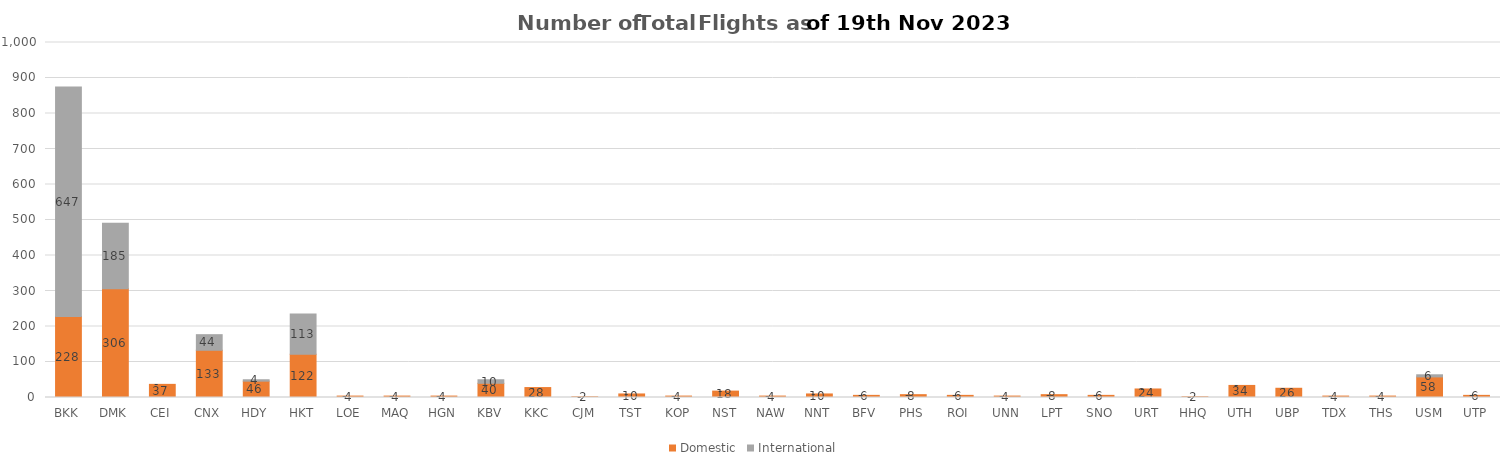
| Category | Domestic | International |
|---|---|---|
| BKK | 228 | 647 |
| DMK | 306 | 185 |
| CEI | 37 | 0 |
| CNX | 133 | 44 |
| HDY | 46 | 4 |
| HKT | 122 | 113 |
| LOE | 4 | 0 |
| MAQ | 4 | 0 |
| HGN | 4 | 0 |
| KBV | 40 | 10 |
| KKC | 28 | 0 |
| CJM | 2 | 0 |
| TST | 10 | 0 |
| KOP | 4 | 0 |
| NST | 18 | 0 |
| NAW | 4 | 0 |
| NNT | 10 | 0 |
| BFV | 6 | 0 |
| PHS | 8 | 0 |
| ROI | 6 | 0 |
| UNN | 4 | 0 |
| LPT | 8 | 0 |
| SNO | 6 | 0 |
| URT | 24 | 0 |
| HHQ | 2 | 0 |
| UTH | 34 | 0 |
| UBP | 26 | 0 |
| TDX | 4 | 0 |
| THS | 4 | 0 |
| USM | 58 | 6 |
| UTP | 6 | 0 |